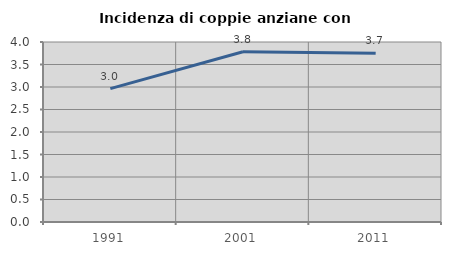
| Category | Incidenza di coppie anziane con figli |
|---|---|
| 1991.0 | 2.964 |
| 2001.0 | 3.783 |
| 2011.0 | 3.75 |